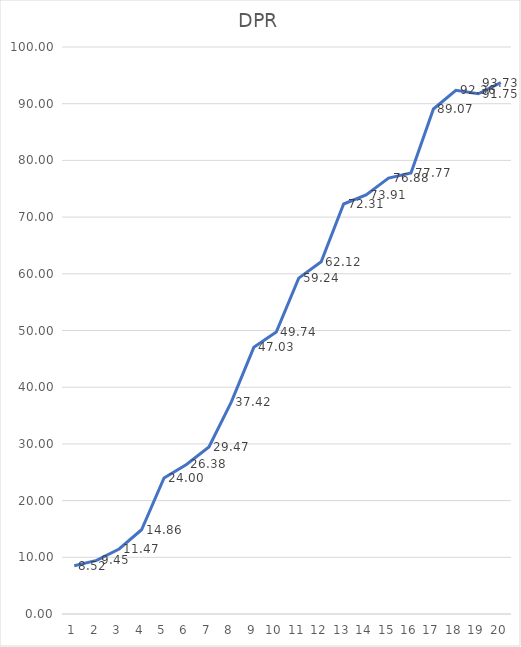
| Category | Series 0 |
|---|---|
| 0 | 8.521 |
| 1 | 9.454 |
| 2 | 11.469 |
| 3 | 14.862 |
| 4 | 23.999 |
| 5 | 26.38 |
| 6 | 29.468 |
| 7 | 37.425 |
| 8 | 47.032 |
| 9 | 49.739 |
| 10 | 59.243 |
| 11 | 62.119 |
| 12 | 72.311 |
| 13 | 73.909 |
| 14 | 76.882 |
| 15 | 77.766 |
| 16 | 89.065 |
| 17 | 92.362 |
| 18 | 91.752 |
| 19 | 93.728 |